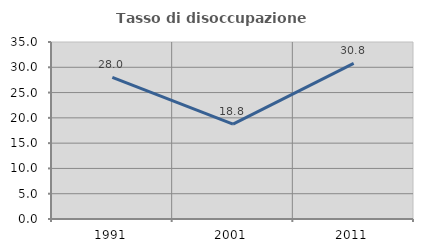
| Category | Tasso di disoccupazione giovanile  |
|---|---|
| 1991.0 | 28 |
| 2001.0 | 18.75 |
| 2011.0 | 30.769 |